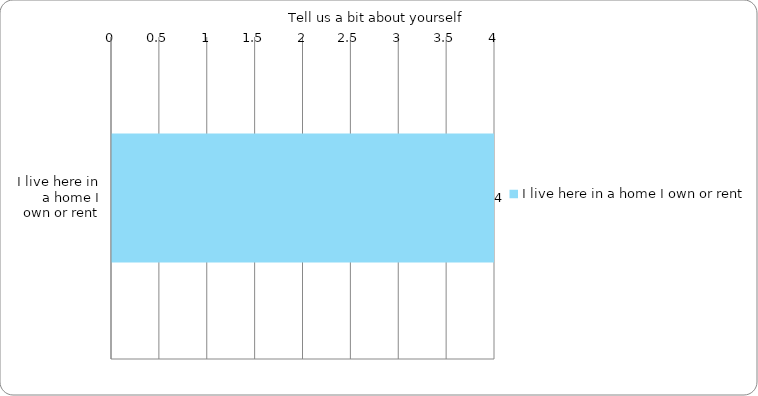
| Category | Series 0 |
|---|---|
| I live here in a home I own or rent | 4 |